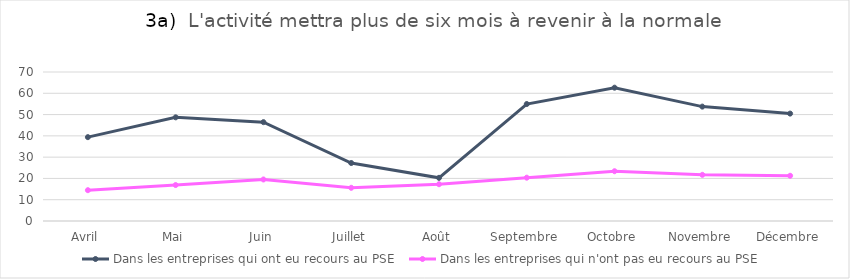
| Category | Dans les entreprises qui ont eu recours au PSE  | Dans les entreprises qui n'ont pas eu recours au PSE  |
|---|---|---|
| Avril | 39.392 | 14.477 |
| Mai | 48.703 | 16.887 |
| Juin | 46.436 | 19.509 |
| Juillet | 27.244 | 15.596 |
| Août | 20.283 | 17.275 |
| Septembre | 54.948 | 20.35 |
| Octobre | 62.633 | 23.384 |
| Novembre | 53.742 | 21.698 |
| Décembre | 50.459 | 21.25 |